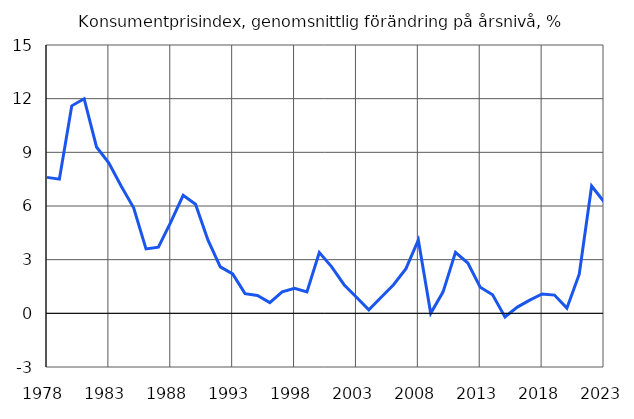
| Category | Konsumentprisindex, genomsnittlig förändring på årsnivå, % |
|---|---|
| 1978.0 | 7.6 |
| 1979.0 | 7.5 |
| 1980.0 | 11.6 |
| 1981.0 | 12 |
| 1982.0 | 9.3 |
| 1983.0 | 8.4 |
| 1984.0 | 7.1 |
| 1985.0 | 5.9 |
| 1986.0 | 3.6 |
| 1987.0 | 3.7 |
| 1988.0 | 5.1 |
| 1989.0 | 6.6 |
| 1990.0 | 6.1 |
| 1991.0 | 4.1 |
| 1992.0 | 2.6 |
| 1993.0 | 2.2 |
| 1994.0 | 1.1 |
| 1995.0 | 1 |
| 1996.0 | 0.6 |
| 1997.0 | 1.2 |
| 1998.0 | 1.4 |
| 1999.0 | 1.2 |
| 2000.0 | 3.4 |
| 2001.0 | 2.6 |
| 2002.0 | 1.6 |
| 2003.0 | 0.9 |
| 2004.0 | 0.2 |
| 2005.0 | 0.9 |
| 2006.0 | 1.6 |
| 2007.0 | 2.5 |
| 2008.0 | 4.1 |
| 2009.0 | 0 |
| 2010.0 | 1.2 |
| 2011.0 | 3.41 |
| 2012.0 | 2.81 |
| 2013.0 | 1.46 |
| 2014.0 | 1.04 |
| 2015.0 | -0.2 |
| 2016.0 | 0.35 |
| 2017.0 | 0.74 |
| 2018.0 | 1.08 |
| 2019.0 | 1.02 |
| 2020.0 | 0.29 |
| 2021.0 | 2.19 |
| 2022.0 | 7.12 |
| 2023.0 | 6.24 |